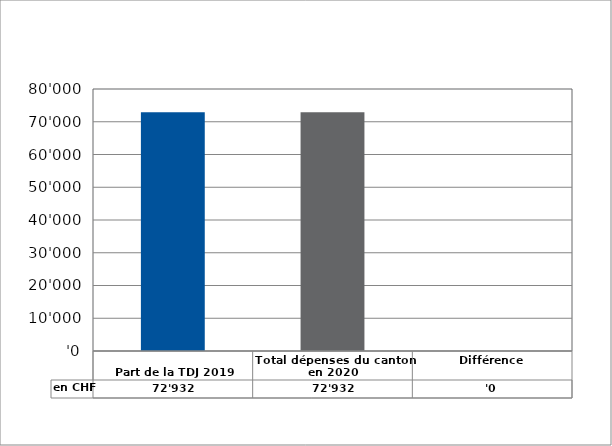
| Category | en CHF |
|---|---|
| 
Part de la TDJ 2019

 | 72932 |
| Total dépenses du canton en 2020 | 72932 |
| Différence | 0 |